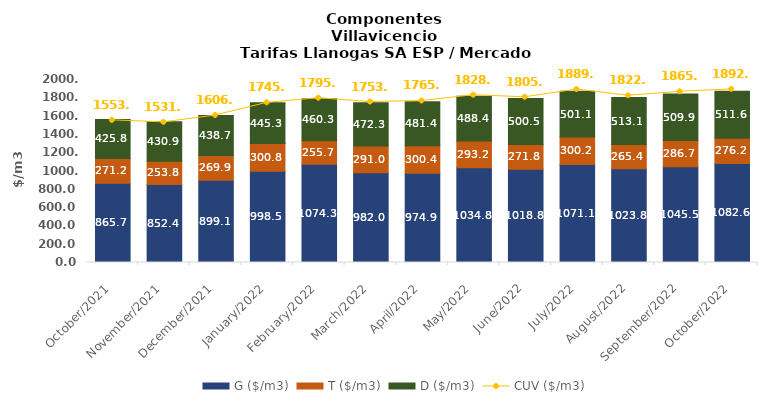
| Category | G ($/m3) | T ($/m3) | D ($/m3) |
|---|---|---|---|
| 2021-10-01 | 865.72 | 271.22 | 425.77 |
| 2021-11-01 | 852.41 | 253.84 | 430.85 |
| 2021-12-01 | 899.1 | 269.91 | 438.66 |
| 2022-01-01 | 998.53 | 300.84 | 445.28 |
| 2022-02-01 | 1074.31 | 255.71 | 460.33 |
| 2022-03-01 | 981.99 | 290.95 | 472.3 |
| 2022-04-01 | 974.88 | 300.4 | 481.41 |
| 2022-05-01 | 1034.82 | 293.23 | 488.41 |
| 2022-06-01 | 1018.78 | 271.84 | 500.5 |
| 2022-07-01 | 1071.1 | 300.23 | 501.07 |
| 2022-08-01 | 1023.83 | 265.35 | 513.09 |
| 2022-09-01 | 1045.5 | 286.69 | 509.94 |
| 2022-10-01 | 1082.55 | 276.23 | 511.58 |